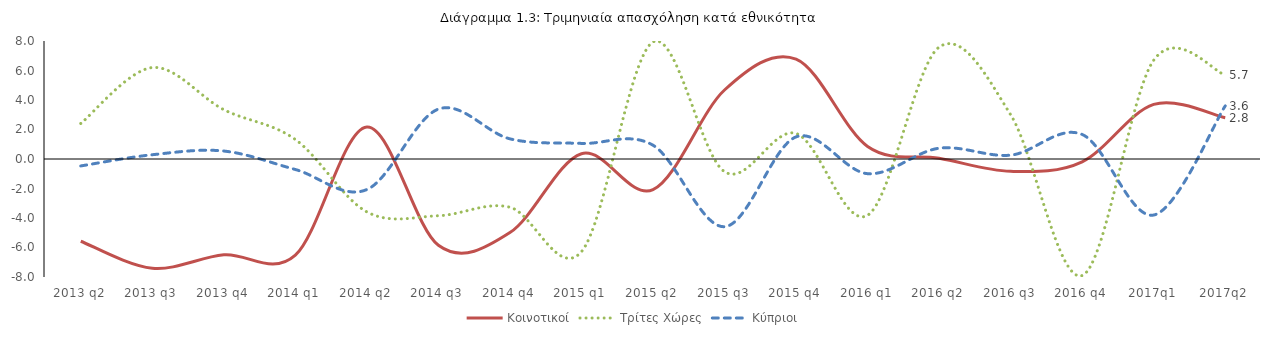
| Category | Κοινοτικοί | Τρίτες Χώρες |
|---|---|---|
| 2013 q2 | -5.576 | 2.408 |
| 2013 q3 | -7.407 | 6.199 |
| 2013 q4 | -6.497 | 3.344 |
| 2014 q1 | -6.522 | 1.323 |
| 2014 q2 | 2.166 | -3.585 |
| 2014 q3 | -5.852 | -3.846 |
| 2014 q4 | -4.99 | -3.269 |
| 2015 q1 | 0.357 | -6.28 |
| 2015 q2 | -2.08 | 7.932 |
| 2015 q3 | 4.677 | -0.86 |
| 2015 q4 | 6.772 | 1.731 |
| 2016 q1 | 0.854 | -3.815 |
| 2016 q2 | 0.049 | 7.584 |
| 2016 q3 | -0.835 | 3.003 |
| 2016 q4 | -0.194 | -7.9 |
| 2017q1 | 3.7 | 6.7 |
| 2017q2 | 2.8 | 5.7 |